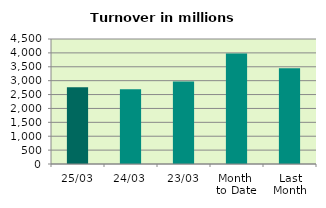
| Category | Series 0 |
|---|---|
| 25/03 | 2762.89 |
| 24/03 | 2693.626 |
| 23/03 | 2973.051 |
| Month 
to Date | 3973.702 |
| Last
Month | 3445.759 |